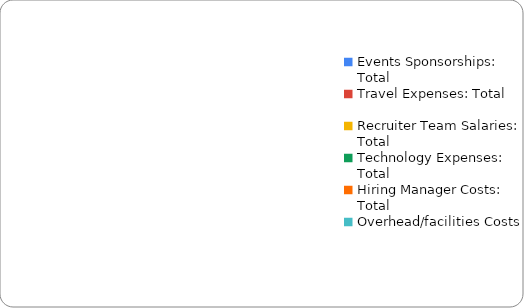
| Category | Total Expense |
|---|---|
| Events Sponsorships: Total | 0 |
| Travel Expenses: Total | 0 |
| Recruiter Team Salaries: Total | 0 |
| Technology Expenses: Total  | 0 |
| Hiring Manager Costs: Total | 0 |
| Overhead/facilities Costs  | 0 |